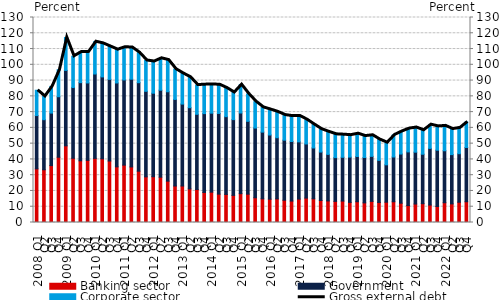
| Category | Banking sector | Government | Corporate sector |
|---|---|---|---|
|   2008 Q1 | 34.032 | 33.783 | 16.043 |
| Q2 | 33.437 | 31.753 | 14.771 |
| Q3 | 36.099 | 33.286 | 16.939 |
| Q4 | 41.387 | 38.378 | 17.105 |
|   2009 Q1 | 48.611 | 47.856 | 20.859 |
| Q2 | 40.735 | 44.851 | 19.849 |
| Q3 | 39.122 | 49.566 | 19.445 |
| Q4 | 39.41 | 49.102 | 19.688 |
|  2010 Q1 | 40.67 | 53.492 | 20.483 |
| Q2 | 40.409 | 51.915 | 21.253 |
| Q3 | 39.005 | 51.761 | 20.832 |
| Q4 | 35.292 | 53.201 | 21.107 |
|  2011 Q1 | 36.402 | 54.014 | 20.738 |
| Q2 | 35.241 | 55.621 | 20.097 |
| Q3 | 32.546 | 56.115 | 19.012 |
| Q4 | 28.948 | 54.248 | 19.553 |
|  2012 Q1 | 29.024 | 52.965 | 20.088 |
| Q2 | 28.735 | 55.159 | 20.222 |
| Q3 | 26.223 | 56.681 | 20.094 |
| Q4 | 23.147 | 54.9 | 19.178 |
|  2013 Q1 | 23.146 | 51.949 | 19.4 |
| Q2 | 21.314 | 51.5 | 19.27 |
| Q3 | 20.934 | 47.687 | 18.527 |
| Q4 | 19.047 | 50.006 | 18.373 |
|  2014 Q1 | 19.246 | 50.088 | 18.18 |
| Q2 | 17.983 | 51.168 | 18.216 |
| Q3 | 17.805 | 49.316 | 18.119 |
| Q4 | 17.185 | 48.056 | 17.197 |
|  2015 Q1 | 18.29 | 51.141 | 18 |
| Q2 | 17.971 | 46.19 | 17.365 |
| Q3 | 15.705 | 44.189 | 16.73 |
| Q4 | 15.013 | 42.304 | 15.681 |
|  2016 Q1 | 14.803 | 40.685 | 16.124 |
| Q2 | 14.991 | 38.772 | 16.322 |
| Q3 | 14.133 | 38.084 | 15.906 |
| Q4 | 13.6 | 37.749 | 16.116 |
|  2017 Q1 | 14.853 | 36.287 | 16.442 |
| Q2 | 15.495 | 34.304 | 15.381 |
| Q3 | 15.057 | 32.214 | 14.849 |
| Q4 | 13.966 | 30.707 | 14.49 |
|  2018 Q1 | 13.674 | 29.515 | 14.272 |
| Q2 | 13.389 | 27.757 | 14.769 |
| Q3 | 13.597 | 27.769 | 14.334 |
| Q4 | 12.758 | 28.717 | 13.91 |
|  2019 Q1 | 13.163 | 28.685 | 14.479 |
| Q2 | 12.448 | 28.754 | 13.602 |
| Q3 | 13.39 | 28.565 | 13.378 |
| Q4 | 12.71 | 26.685 | 13.156 |
|  2020 Q1 | 12.887 | 23.698 | 14.026 |
| Q2 | 13.152 | 28.389 | 13.98 |
| Q3 | 12.243 | 31.167 | 14.303 |
| Q4 | 10.727 | 34.043 | 14.769 |
|  2021 Q1 | 11.723 | 32.87 | 15.635 |
| Q2 | 11.928 | 31.372 | 15.193 |
| Q3 | 11.08 | 35.905 | 15.054 |
| Q4 | 10.158 | 35.697 | 15.081 |
|  2022 Q1 | 12.546 | 32.952 | 15.781 |
| Q2 | 11.803 | 31.242 | 16.216 |
| Q3 | 12.861 | 30.768 | 16.405 |
| Q4 | 13.165 | 34.413 | 16.207 |